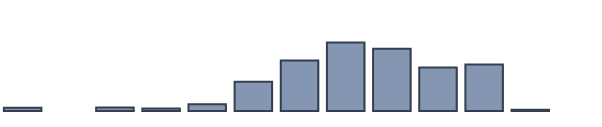
| Category | Series 0 |
|---|---|
| 0 | 1 |
| 1 | 0 |
| 2 | 1.1 |
| 3 | 0.8 |
| 4 | 2.1 |
| 5 | 9.2 |
| 6 | 15.9 |
| 7 | 21.6 |
| 8 | 19.6 |
| 9 | 13.7 |
| 10 | 14.7 |
| 11 | 0.4 |
| 12 | 0 |